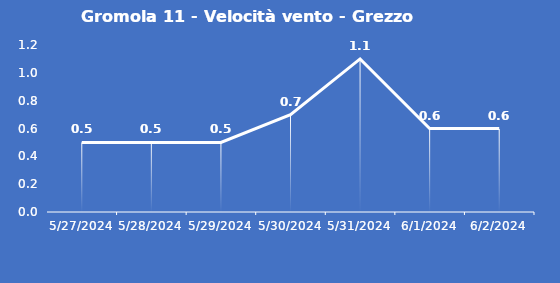
| Category | Gromola 11 - Velocità vento - Grezzo (m/s) |
|---|---|
| 5/27/24 | 0.5 |
| 5/28/24 | 0.5 |
| 5/29/24 | 0.5 |
| 5/30/24 | 0.7 |
| 5/31/24 | 1.1 |
| 6/1/24 | 0.6 |
| 6/2/24 | 0.6 |